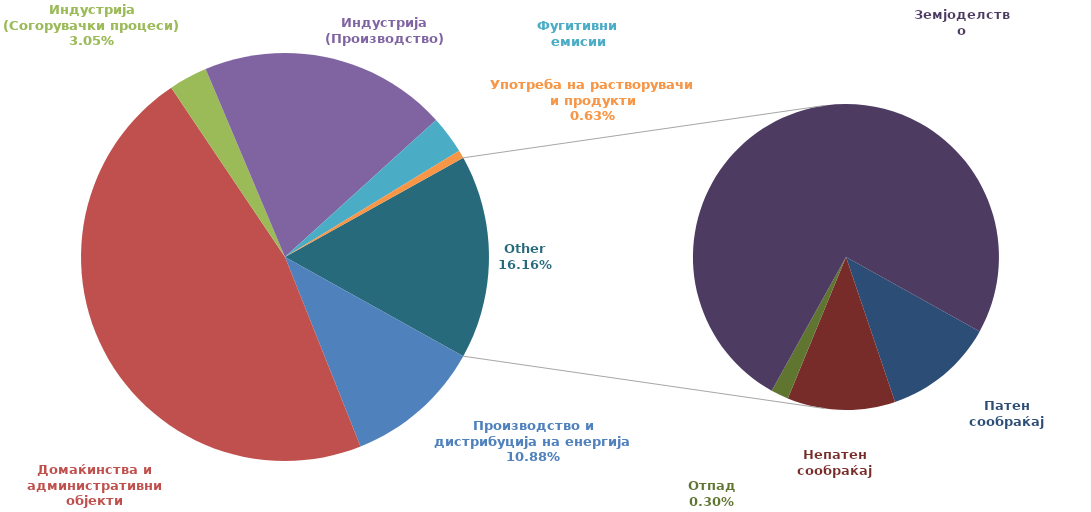
| Category | Series 0 |
|---|---|
| Производство и дистрибуција на енергија | 0.109 |
| Домаќинства и административни објекти | 0.466 |
| Индустрија (Согорувачки процеси) | 0.031 |
| Индустрија (Производство) | 0.196 |
| Фугитивни емисии | 0.03 |
| Употреба на растворувачи и продукти | 0.006 |
| Патен сообраќај | 0.019 |
| Непатен сообраќај | 0.018 |
| Oтпад | 0.003 |
| Земјоделство | 0.121 |